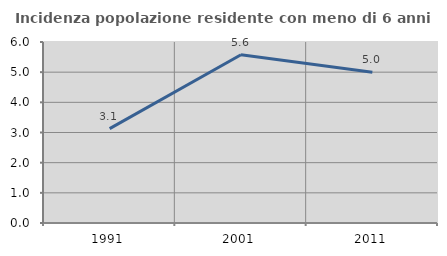
| Category | Incidenza popolazione residente con meno di 6 anni |
|---|---|
| 1991.0 | 3.128 |
| 2001.0 | 5.577 |
| 2011.0 | 4.995 |